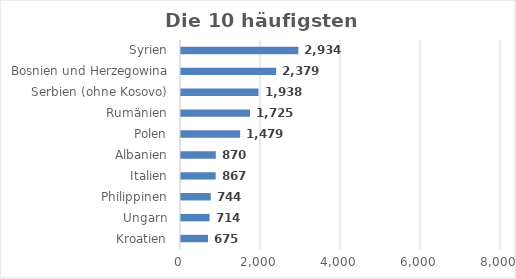
| Category | Series 0 |
|---|---|
| Kroatien | 675 |
| Ungarn | 714 |
| Philippinen | 744 |
| Italien | 867 |
| Albanien | 870 |
| Polen | 1479 |
| Rumänien | 1725 |
| Serbien (ohne Kosovo) | 1938 |
| Bosnien und Herzegowina | 2379 |
| Syrien | 2934 |